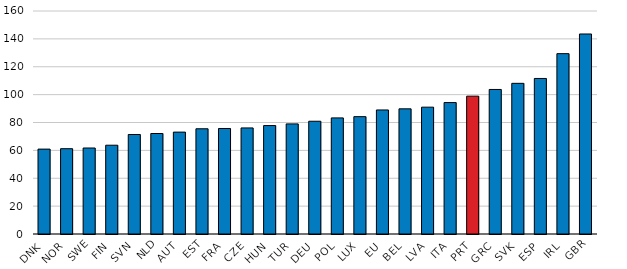
| Category | 2015 |
|---|---|
| DNK | 60.9 |
| NOR | 61.2 |
| SWE | 61.7 |
| FIN | 63.7 |
| SVN | 71.4 |
| NLD | 72.1 |
| AUT | 73.1 |
| EST | 75.5 |
| FRA | 75.7 |
| CZE | 76.1 |
| HUN | 77.8 |
| TUR | 79 |
| DEU | 80.9 |
| POL | 83.3 |
| LUX | 84.2 |
| EU | 89 |
| BEL | 89.8 |
| LVA | 91 |
| ITA | 94.3 |
| PRT | 98.9 |
| GRC | 103.7 |
| SVK | 108.1 |
| ESP | 111.6 |
| IRL | 129.4 |
| GBR | 143.5 |